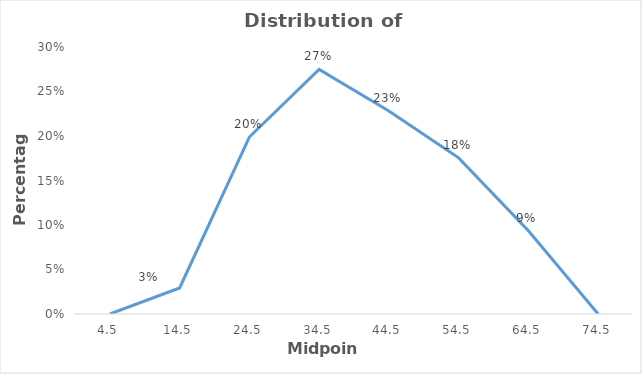
| Category | Series 0 |
|---|---|
| 4.5 | 0 |
| 14.5 | 0.029 |
| 24.5 | 0.199 |
| 34.5 | 0.275 |
| 44.5 | 0.228 |
| 54.5 | 0.175 |
| 64.5 | 0.094 |
| 74.5 | 0 |